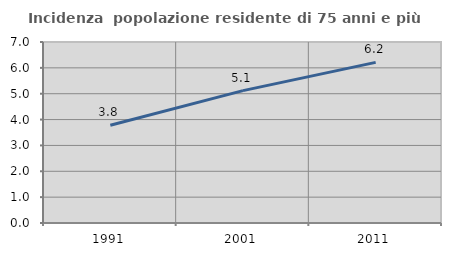
| Category | Incidenza  popolazione residente di 75 anni e più |
|---|---|
| 1991.0 | 3.78 |
| 2001.0 | 5.119 |
| 2011.0 | 6.212 |